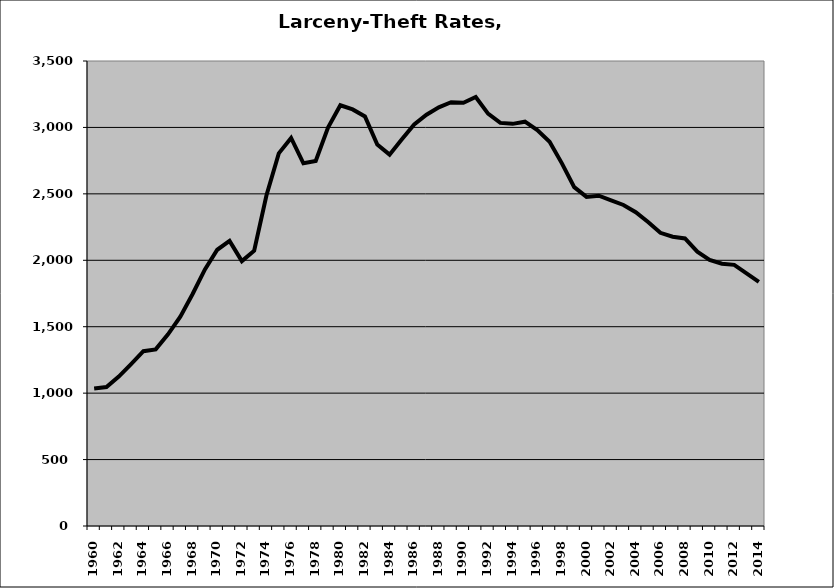
| Category | Larceny-Theft |
|---|---|
| 1960.0 | 1034.668 |
| 1961.0 | 1045.401 |
| 1962.0 | 1124.826 |
| 1963.0 | 1219.102 |
| 1964.0 | 1315.469 |
| 1965.0 | 1329.33 |
| 1966.0 | 1442.917 |
| 1967.0 | 1575.837 |
| 1968.0 | 1746.599 |
| 1969.0 | 1930.928 |
| 1970.0 | 2079.265 |
| 1971.0 | 2145.462 |
| 1972.0 | 1993.565 |
| 1973.0 | 2071.899 |
| 1974.0 | 2489.451 |
| 1975.0 | 2804.799 |
| 1976.0 | 2921.284 |
| 1977.0 | 2729.924 |
| 1978.0 | 2747.422 |
| 1979.0 | 2999.105 |
| 1980.0 | 3167.039 |
| 1981.0 | 3135.283 |
| 1982.0 | 3083.123 |
| 1983.0 | 2871.253 |
| 1984.0 | 2795.241 |
| 1985.0 | 2911.176 |
| 1986.0 | 3022.14 |
| 1987.0 | 3095.416 |
| 1988.0 | 3151.699 |
| 1989.0 | 3189.558 |
| 1990.0 | 3185.092 |
| 1991.0 | 3229.081 |
| 1992.0 | 3103.638 |
| 1993.0 | 3033.916 |
| 1994.0 | 3026.89 |
| 1995.0 | 3043.231 |
| 1996.0 | 2980.329 |
| 1997.0 | 2891.798 |
| 1998.0 | 2729.46 |
| 1999.0 | 2550.698 |
| 2000.0 | 2477.273 |
| 2001.0 | 2485.745 |
| 2002.0 | 2450.701 |
| 2003.0 | 2416.461 |
| 2004.0 | 2362.311 |
| 2005.0 | 2287.786 |
| 2006.0 | 2206.762 |
| 2007.0 | 2177.756 |
| 2008.0 | 2164.452 |
| 2009.0 | 2064.482 |
| 2010.0 | 2003.549 |
| 2011.0 | 1974.113 |
| 2012.0 | 1965.4 |
| 2013.0 | 1901.636 |
| 2014.0 | 1837.342 |